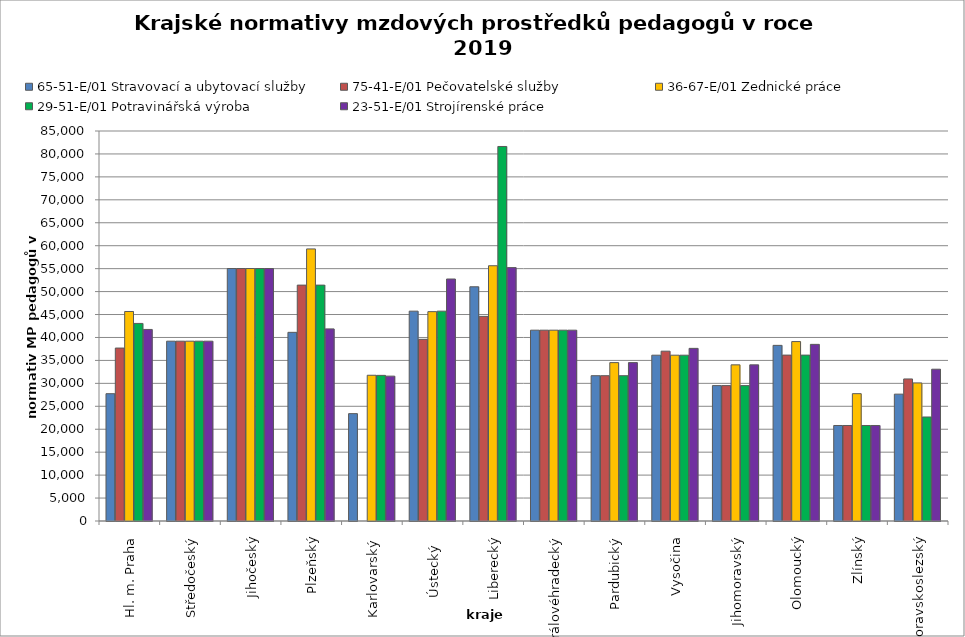
| Category | 65-51-E/01 Stravovací a ubytovací služby | 75-41-E/01 Pečovatelské služby | 36-67-E/01 Zednické práce | 29-51-E/01 Potravinářská výroba | 23-51-E/01 Strojírenské práce |
|---|---|---|---|---|---|
| Hl. m. Praha | 27744.304 | 37692.175 | 45662.5 | 43060.904 | 41748.571 |
| Středočeský | 39191.538 | 39191.538 | 39191.538 | 39191.538 | 39191.538 |
| Jihočeský | 55021.93 | 55021.93 | 55021.93 | 55021.93 | 55021.93 |
| Plzeňský | 41118.124 | 51409.245 | 59297.789 | 51409.245 | 41873.278 |
| Karlovarský  | 23400 | 0 | 31764.706 | 31740.769 | 31574.213 |
| Ústecký   | 45734.266 | 39596.367 | 45627.907 | 45734.266 | 52741.935 |
| Liberecký | 51047.895 | 44596.787 | 55632.188 | 81625.635 | 55225.311 |
| Královéhradecký | 41588.605 | 41588.605 | 41588.605 | 41588.605 | 41588.605 |
| Pardubický | 31670.476 | 31670.476 | 34519.723 | 31670.476 | 34519.723 |
| Vysočina | 36136.984 | 37013.802 | 36136.984 | 36136.984 | 37625.737 |
| Jihomoravský | 29505.026 | 29505.026 | 34031.609 | 29505.026 | 34031.609 |
| Olomoucký | 38277.85 | 36157.846 | 39105.824 | 36157.846 | 38497.297 |
| Zlínský | 20815.2 | 20815.2 | 27753.6 | 20815.2 | 20815.2 |
| Moravskoslezský | 27647.577 | 30959.831 | 30090.411 | 22668.731 | 33081.325 |